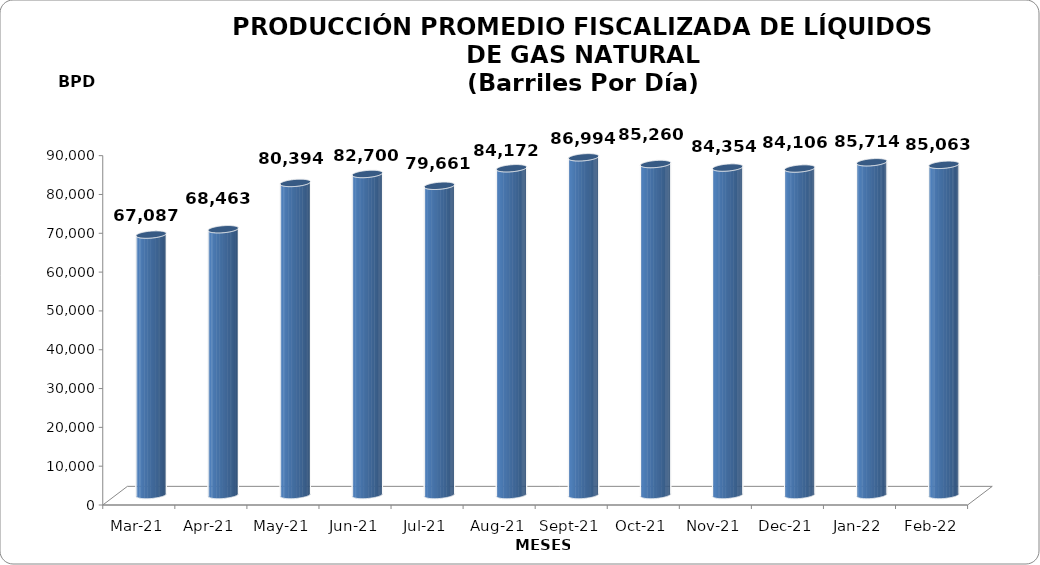
| Category | Series 0 |
|---|---|
| 2021-03-01 | 67087 |
| 2021-04-01 | 68463 |
| 2021-05-01 | 80393.645 |
| 2021-06-01 | 82699.833 |
| 2021-07-01 | 79661.29 |
| 2021-08-01 | 84171.548 |
| 2021-09-01 | 86994 |
| 2021-10-01 | 85260 |
| 2021-11-01 | 84354 |
| 2021-12-01 | 84106 |
| 2022-01-01 | 85714.355 |
| 2022-02-01 | 85063 |